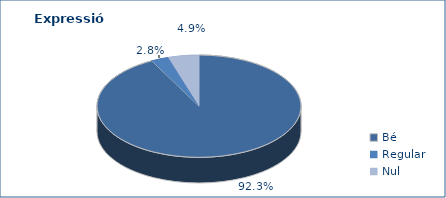
| Category | Series 0 |
|---|---|
| Bé | 5168 |
| Regular | 155 |
| Nul | 274 |